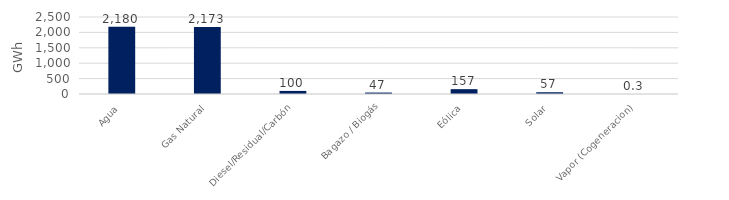
| Category | Series 0 |
|---|---|
| Agua | 2180.434 |
| Gas Natural | 2172.57 |
| Diesel/Residual/Carbón | 99.988 |
| Bagazo / Biogás | 46.964 |
| Eólica | 157.234 |
| Solar | 57.34 |
| Vapor (Cogeneracion) | 0.338 |